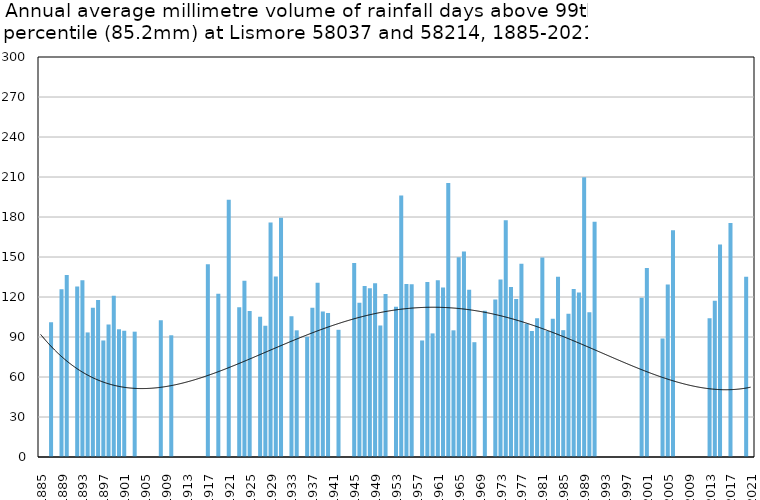
| Category | Annual average mm in days above 99th percentile |
|---|---|
| 1885 | 0 |
| 1886 | 0 |
| 1887 | 101.05 |
| 1888 | 0 |
| 1889 | 125.85 |
| 1890 | 136.55 |
| 1891 | 0 |
| 1892 | 127.84 |
| 1893 | 132.575 |
| 1894 | 93.433 |
| 1895 | 112 |
| 1896 | 117.75 |
| 1897 | 87.4 |
| 1898 | 99.3 |
| 1899 | 120.92 |
| 1900 | 95.8 |
| 1901 | 94.7 |
| 1902 | 0 |
| 1903 | 94 |
| 1904 | 0 |
| 1905 | 0 |
| 1906 | 0 |
| 1907 | 0 |
| 1908 | 102.6 |
| 1909 | 0 |
| 1910 | 91.3 |
| 1911 | 0 |
| 1912 | 0 |
| 1913 | 0 |
| 1914 | 0 |
| 1915 | 0 |
| 1916 | 0 |
| 1917 | 144.5 |
| 1918 | 0 |
| 1919 | 122.45 |
| 1920 | 0 |
| 1921 | 192.933 |
| 1922 | 0 |
| 1923 | 112.3 |
| 1924 | 132.1 |
| 1925 | 109.425 |
| 1926 | 0 |
| 1927 | 105.2 |
| 1928 | 98.4 |
| 1929 | 175.875 |
| 1930 | 135.4 |
| 1931 | 179.433 |
| 1932 | 0 |
| 1933 | 105.65 |
| 1934 | 95 |
| 1935 | 0 |
| 1936 | 90.2 |
| 1937 | 111.933 |
| 1938 | 130.6 |
| 1939 | 109.2 |
| 1940 | 108 |
| 1941 | 0 |
| 1942 | 95.4 |
| 1943 | 0 |
| 1944 | 0 |
| 1945 | 145.55 |
| 1946 | 115.7 |
| 1947 | 128.3 |
| 1948 | 126.5 |
| 1949 | 130.4 |
| 1950 | 98.6 |
| 1951 | 122.2 |
| 1952 | 0 |
| 1953 | 112.65 |
| 1954 | 196.033 |
| 1955 | 129.68 |
| 1956 | 129.6 |
| 1957 | 0 |
| 1958 | 87.4 |
| 1959 | 131.2 |
| 1960 | 92.7 |
| 1961 | 132.6 |
| 1962 | 127.08 |
| 1963 | 205.5 |
| 1964 | 95 |
| 1965 | 149.75 |
| 1966 | 154.2 |
| 1967 | 125.35 |
| 1968 | 86.1 |
| 1969 | 0 |
| 1970 | 109.6 |
| 1971 | 0 |
| 1972 | 118.05 |
| 1973 | 133.1 |
| 1974 | 177.5 |
| 1975 | 127.433 |
| 1976 | 118.55 |
| 1977 | 145 |
| 1978 | 100 |
| 1979 | 94.5 |
| 1980 | 104 |
| 1981 | 149.7 |
| 1982 | 94.5 |
| 1983 | 103.6 |
| 1984 | 135.2 |
| 1985 | 95.133 |
| 1986 | 107.4 |
| 1987 | 126 |
| 1988 | 123.45 |
| 1989 | 209.8 |
| 1990 | 108.5 |
| 1991 | 176.4 |
| 1992 | 0 |
| 1993 | 0 |
| 1994 | 0 |
| 1995 | 0 |
| 1996 | 0 |
| 1997 | 0 |
| 1998 | 0 |
| 1999 | 0 |
| 2000 | 119.4 |
| 2001 | 141.8 |
| 2002 | 0 |
| 2003 | 0 |
| 2004 | 88.9 |
| 2005 | 129.4 |
| 2006 | 170 |
| 2007 | 0 |
| 2008 | 0 |
| 2009 | 0 |
| 2010 | 0 |
| 2011 | 0 |
| 2012 | 0 |
| 2013 | 104 |
| 2014 | 117.2 |
| 2015 | 159.4 |
| 2016 | 0 |
| 2017 | 175.533 |
| 2018 | 0 |
| 2019 | 0 |
| 2020 | 135.1 |
| 2021 | 0 |